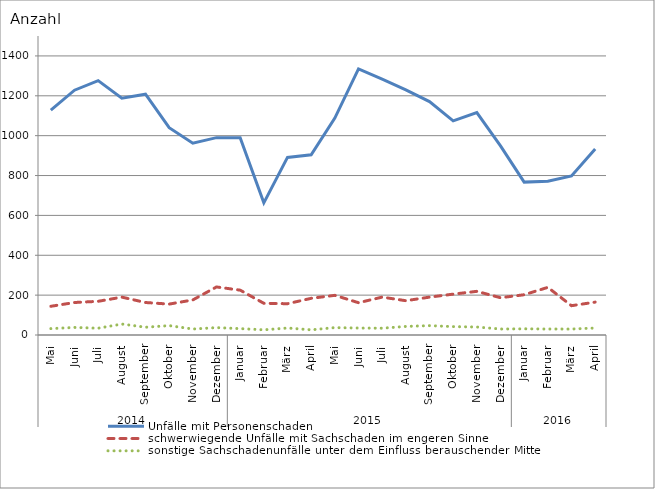
| Category | Unfälle mit Personenschaden | schwerwiegende Unfälle mit Sachschaden im engeren Sinne | sonstige Sachschadenunfälle unter dem Einfluss berauschender Mittel |
|---|---|---|---|
| 0 | 1128 | 144 | 32 |
| 1 | 1228 | 163 | 38 |
| 2 | 1276 | 169 | 34 |
| 3 | 1188 | 190 | 55 |
| 4 | 1208 | 163 | 39 |
| 5 | 1040 | 155 | 47 |
| 6 | 962 | 176 | 30 |
| 7 | 990 | 241 | 37 |
| 8 | 990 | 225 | 32 |
| 9 | 663 | 159 | 26 |
| 10 | 891 | 157 | 35 |
| 11 | 904 | 184 | 26 |
| 12 | 1088 | 199 | 37 |
| 13 | 1335 | 162 | 35 |
| 14 | 1284 | 190 | 34 |
| 15 | 1230 | 172 | 43 |
| 16 | 1171 | 190 | 47 |
| 17 | 1074 | 205 | 42 |
| 18 | 1116 | 219 | 40 |
| 19 | 949 | 187 | 30 |
| 20 | 767 | 202 | 31 |
| 21 | 771 | 239 | 30 |
| 22 | 798 | 147 | 30 |
| 23 | 933 | 165 | 35 |